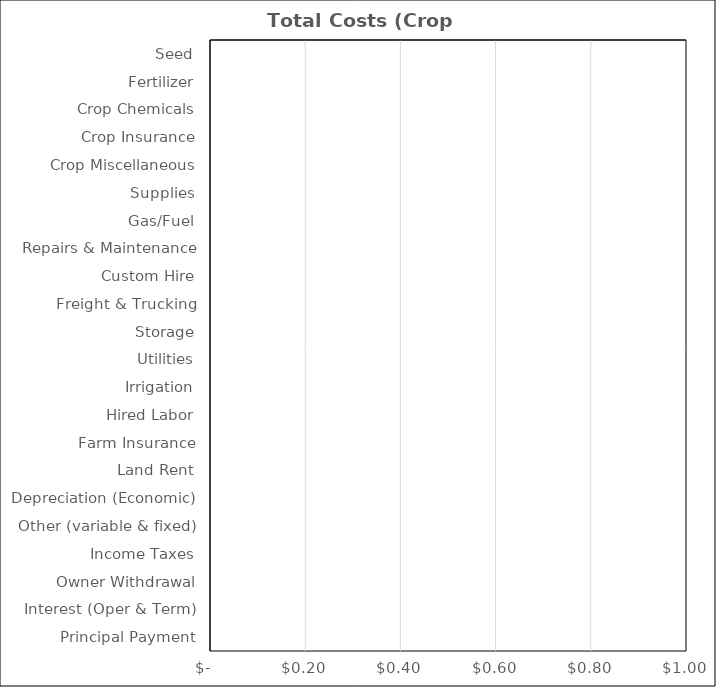
| Category | Corn Silage |
|---|---|
| Seed | 0 |
| Fertilizer | 0 |
| Crop Chemicals | 0 |
| Crop Insurance | 0 |
| Crop Miscellaneous | 0 |
| Supplies | 0 |
| Gas/Fuel | 0 |
| Repairs & Maintenance | 0 |
| Custom Hire | 0 |
| Freight & Trucking | 0 |
| Storage | 0 |
| Utilities | 0 |
| Irrigation | 0 |
| Hired Labor | 0 |
| Farm Insurance | 0 |
| Land Rent | 0 |
| Depreciation (Economic) | 0 |
| Other (variable & fixed) | 0 |
| Income Taxes | 0 |
| Owner Withdrawal | 0 |
| Interest (Oper & Term) | 0 |
| Principal Payment | 0 |